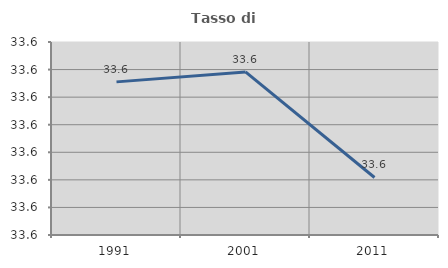
| Category | Tasso di occupazione   |
|---|---|
| 1991.0 | 33.616 |
| 2001.0 | 33.619 |
| 2011.0 | 33.581 |